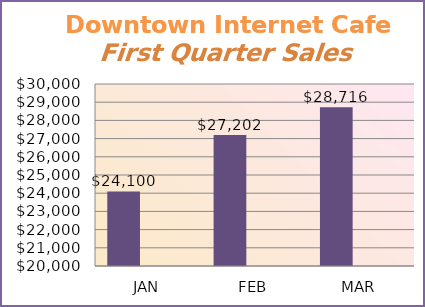
| Category | Total Sales  $24,100   $27,202   $28,716  | Series 1 | Series 2 | Series 3 |
|---|---|---|---|---|
| JAN | 24100 |  |  |  |
| FEB | 27202 |  |  |  |
| MAR | 28716 |  |  |  |